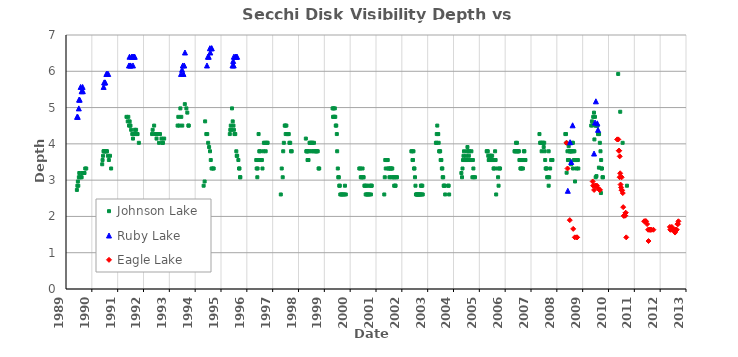
| Category | LineChart |
|---|---|
| 1998-01-01 | 0 |
| 1999-01-01 | 0 |
| 2000-01-01 | 0 |
| 2001-01-01 | 0 |
| 2002-01-01 | 0 |
| 2003-01-01 | 0 |
| 2004-01-01 | 0 |
| 2005-01-01 | 0 |
| 2006-01-01 | 0 |
| 2007-01-01 | 0 |
| 2008-01-01 | 0 |
| 2009-01-01 | 0 |
| 2010-01-01 | 0 |
| 2011-01-01 | 0 |
| 2012-01-01 | 0 |